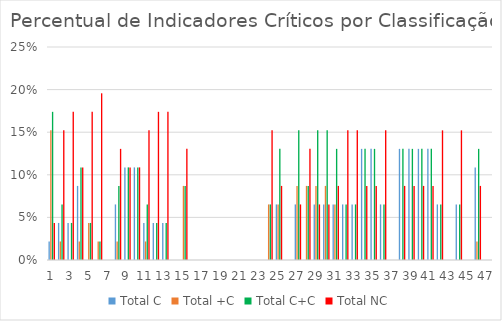
| Category | Total C | Total +C | Total C+C | Total NC |
|---|---|---|---|---|
| 0 | 0.022 | 0.152 | 0.174 | 0.043 |
| 1 | 0.043 | 0.022 | 0.065 | 0.152 |
| 2 | 0.043 | 0 | 0.043 | 0.174 |
| 3 | 0.087 | 0.022 | 0.109 | 0.109 |
| 4 | 0 | 0.043 | 0.043 | 0.174 |
| 5 | 0 | 0.022 | 0.022 | 0.196 |
| 6 | 0 | 0 | 0 | 0 |
| 7 | 0.065 | 0.022 | 0.087 | 0.13 |
| 8 | 0.109 | 0 | 0.109 | 0.109 |
| 9 | 0.109 | 0 | 0.109 | 0.109 |
| 10 | 0.043 | 0.022 | 0.065 | 0.152 |
| 11 | 0.043 | 0 | 0.043 | 0.174 |
| 12 | 0.043 | 0 | 0.043 | 0.174 |
| 13 | 0 | 0 | 0 | 0 |
| 14 | 0 | 0.087 | 0.087 | 0.13 |
| 15 | 0 | 0 | 0 | 0 |
| 16 | 0 | 0 | 0 | 0 |
| 17 | 0 | 0 | 0 | 0 |
| 18 | 0 | 0 | 0 | 0 |
| 19 | 0 | 0 | 0 | 0 |
| 20 | 0 | 0 | 0 | 0 |
| 21 | 0 | 0 | 0 | 0 |
| 22 | 0 | 0 | 0 | 0 |
| 23 | 0 | 0.065 | 0.065 | 0.152 |
| 24 | 0.065 | 0.065 | 0.13 | 0.087 |
| 25 | 0 | 0 | 0 | 0 |
| 26 | 0.065 | 0.087 | 0.152 | 0.065 |
| 27 | 0 | 0.087 | 0.087 | 0.13 |
| 28 | 0.065 | 0.087 | 0.152 | 0.065 |
| 29 | 0.065 | 0.087 | 0.152 | 0.065 |
| 30 | 0.065 | 0.065 | 0.13 | 0.087 |
| 31 | 0.065 | 0 | 0.065 | 0.152 |
| 32 | 0.065 | 0 | 0.065 | 0.152 |
| 33 | 0.13 | 0 | 0.13 | 0.087 |
| 34 | 0.13 | 0 | 0.13 | 0.087 |
| 35 | 0.065 | 0 | 0.065 | 0.152 |
| 36 | 0 | 0 | 0 | 0 |
| 37 | 0.13 | 0 | 0.13 | 0.087 |
| 38 | 0.13 | 0 | 0.13 | 0.087 |
| 39 | 0.13 | 0 | 0.13 | 0.087 |
| 40 | 0.13 | 0 | 0.13 | 0.087 |
| 41 | 0.065 | 0 | 0.065 | 0.152 |
| 42 | 0 | 0 | 0 | 0 |
| 43 | 0.065 | 0 | 0.065 | 0.152 |
| 44 | 0 | 0 | 0 | 0 |
| 45 | 0.109 | 0.022 | 0.13 | 0.087 |
| 46 | 0 | 0 | 0 | 0 |